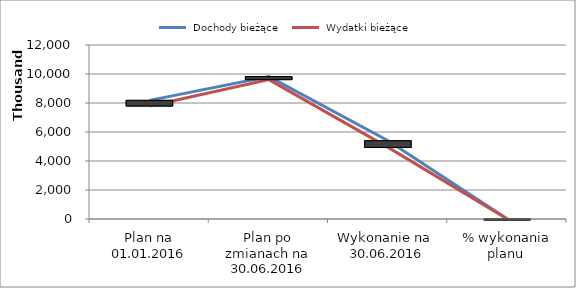
| Category |  Dochody bieżące |  Wydatki bieżące |
|---|---|---|
| 0 | 1 | 1 |